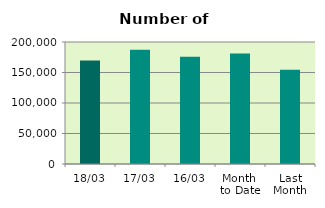
| Category | Series 0 |
|---|---|
| 18/03 | 169638 |
| 17/03 | 187318 |
| 16/03 | 175626 |
| Month 
to Date | 181249.571 |
| Last
Month | 154356.5 |